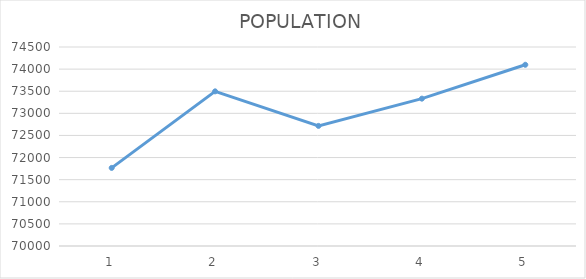
| Category | Series 0 |
|---|---|
| 0 | 71766 |
| 1 | 73497 |
| 2 | 72716 |
| 3 | 73332 |
| 4 | 74098 |